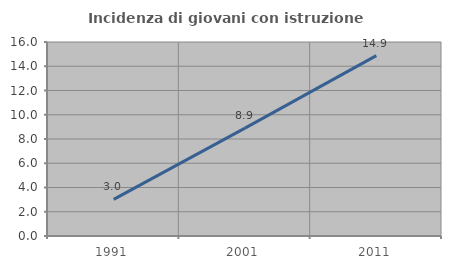
| Category | Incidenza di giovani con istruzione universitaria |
|---|---|
| 1991.0 | 3.019 |
| 2001.0 | 8.902 |
| 2011.0 | 14.876 |